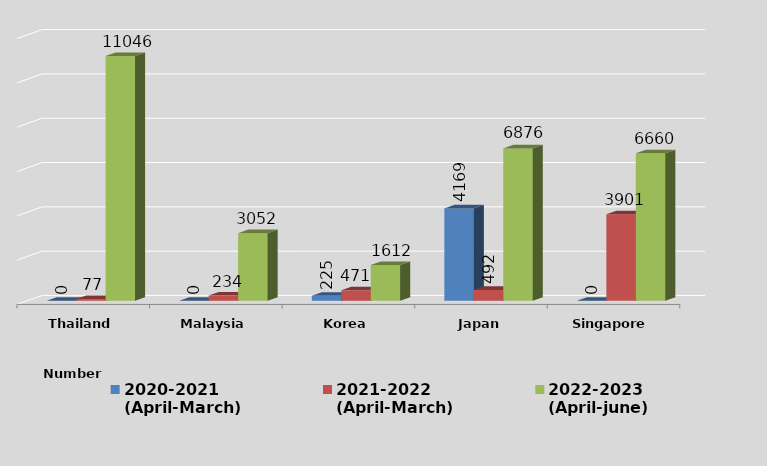
| Category | 2020-2021
(April-March) | 2021-2022
(April-March) | 2022-2023
(April-june) |
|---|---|---|---|
| Thailand | 0 | 77 | 11046 |
| Malaysia | 0 | 234 | 3052 |
| Korea | 225 | 471 | 1612 |
| Japan | 4169 | 492 | 6876 |
| Singapore | 0 | 3901 | 6660 |